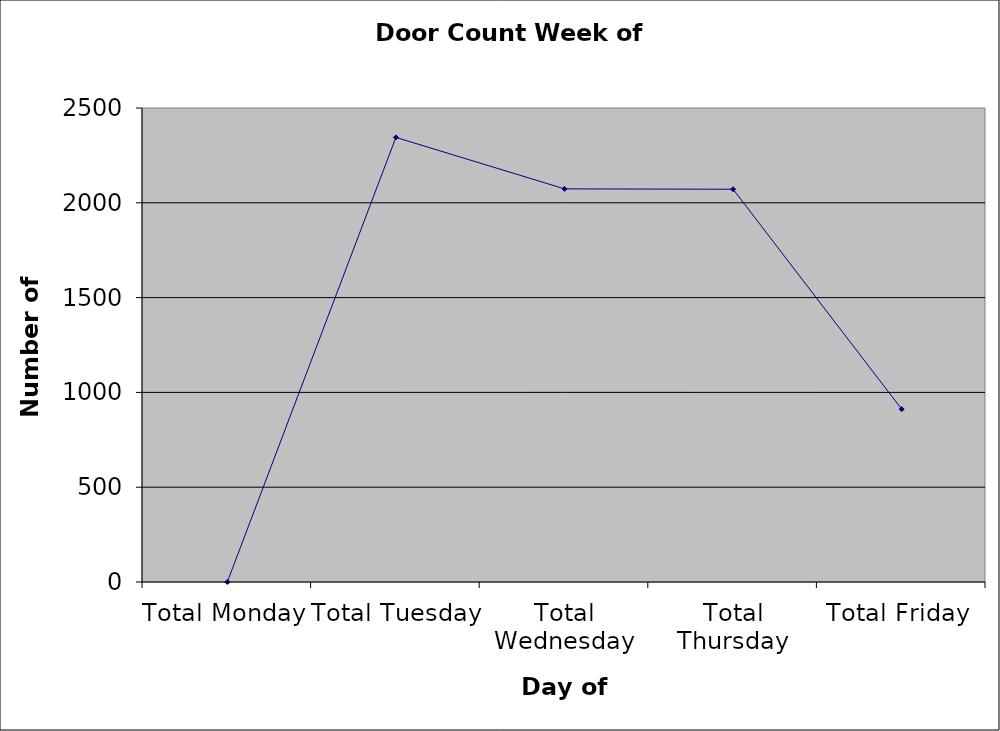
| Category | Series 0 |
|---|---|
| Total Monday | 0 |
| Total Tuesday | 2345 |
| Total Wednesday | 2073.5 |
| Total Thursday | 2071.5 |
| Total Friday | 911.5 |